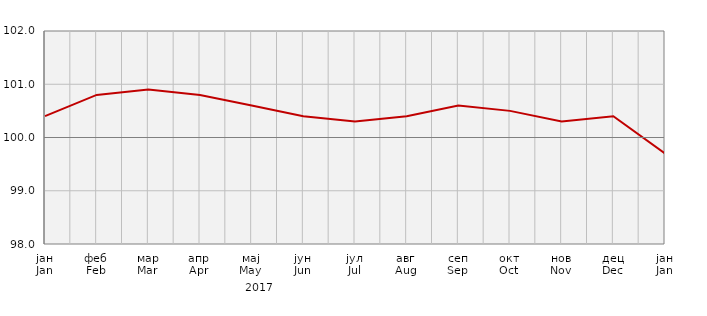
| Category | Индекси потрошачких цијена
Consumer price indices |
|---|---|
| јан
Jan | 100.4 |
| феб
Feb | 100.8 |
| мар
Mar | 100.9 |
| апр
Apr | 100.8 |
| мај
May | 100.6 |
| јун
Jun | 100.4 |
| јул
Jul | 100.3 |
| авг
Aug | 100.4 |
| сеп
Sep | 100.6 |
| окт
Oct | 100.5 |
| нов
Nov | 100.3 |
| дец
Dec | 100.4 |
| јан
Jan | 99.7 |